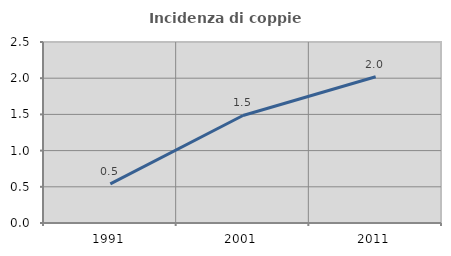
| Category | Incidenza di coppie miste |
|---|---|
| 1991.0 | 0.54 |
| 2001.0 | 1.485 |
| 2011.0 | 2.019 |